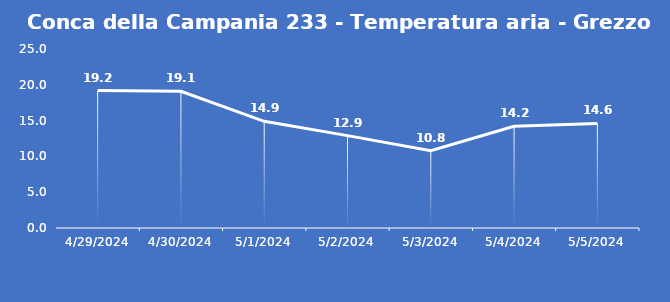
| Category | Conca della Campania 233 - Temperatura aria - Grezzo (°C) |
|---|---|
| 4/29/24 | 19.2 |
| 4/30/24 | 19.1 |
| 5/1/24 | 14.9 |
| 5/2/24 | 12.9 |
| 5/3/24 | 10.8 |
| 5/4/24 | 14.2 |
| 5/5/24 | 14.6 |